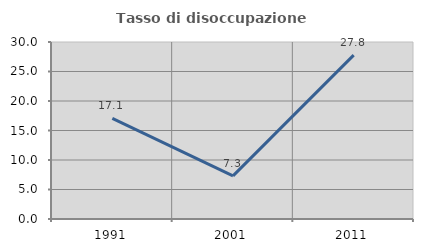
| Category | Tasso di disoccupazione giovanile  |
|---|---|
| 1991.0 | 17.054 |
| 2001.0 | 7.317 |
| 2011.0 | 27.778 |